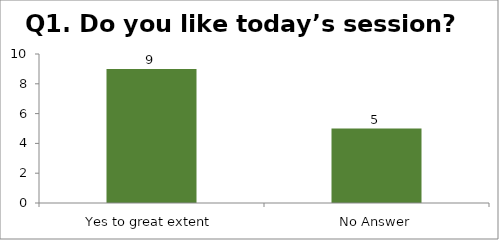
| Category | Q1. Do you like today’s session? |
|---|---|
| Yes to great extent | 9 |
| No Answer | 5 |